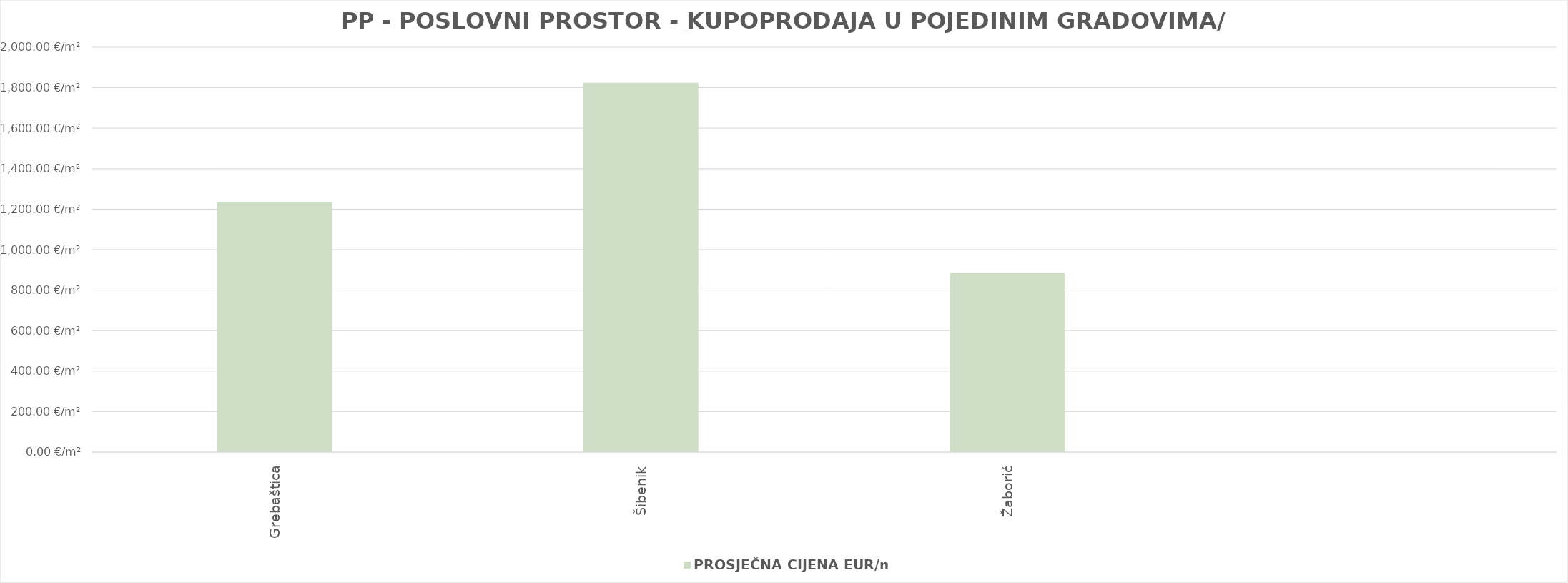
| Category | PROSJEČNA CIJENA EUR/m2 |
|---|---|
| Grebaštica | 1903-05-20 03:58:11 |
| Šibenik | 1904-12-28 04:28:32 |
| Žaborić | 1902-06-03 22:50:40 |